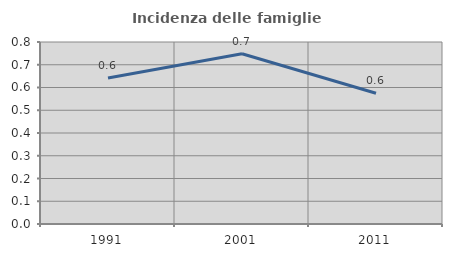
| Category | Incidenza delle famiglie numerose |
|---|---|
| 1991.0 | 0.642 |
| 2001.0 | 0.748 |
| 2011.0 | 0.575 |